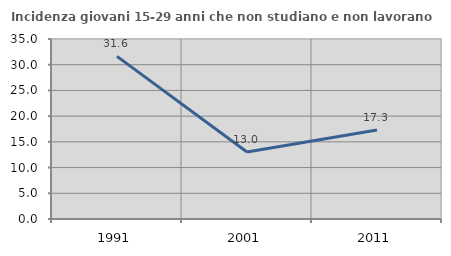
| Category | Incidenza giovani 15-29 anni che non studiano e non lavorano  |
|---|---|
| 1991.0 | 31.624 |
| 2001.0 | 13.043 |
| 2011.0 | 17.308 |